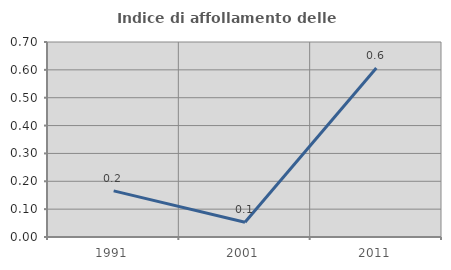
| Category | Indice di affollamento delle abitazioni  |
|---|---|
| 1991.0 | 0.166 |
| 2001.0 | 0.053 |
| 2011.0 | 0.607 |